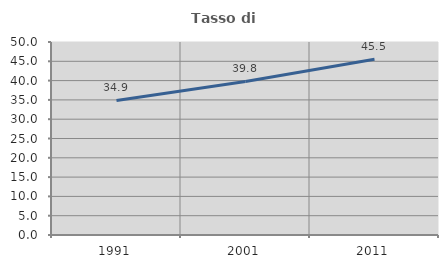
| Category | Tasso di occupazione   |
|---|---|
| 1991.0 | 34.857 |
| 2001.0 | 39.792 |
| 2011.0 | 45.545 |